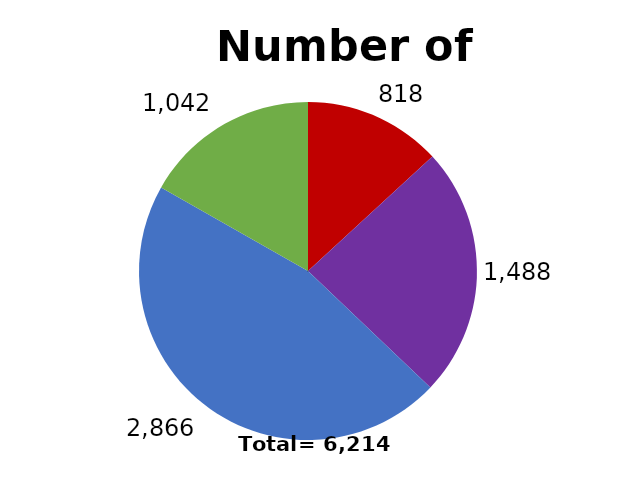
| Category | Series 0 |
|---|---|
| Biopharma core | 818 |
| Biopharma Service & Supply | 1488 |
| Med Tech core | 2866 |
| Med Tech Service & supply | 1042 |